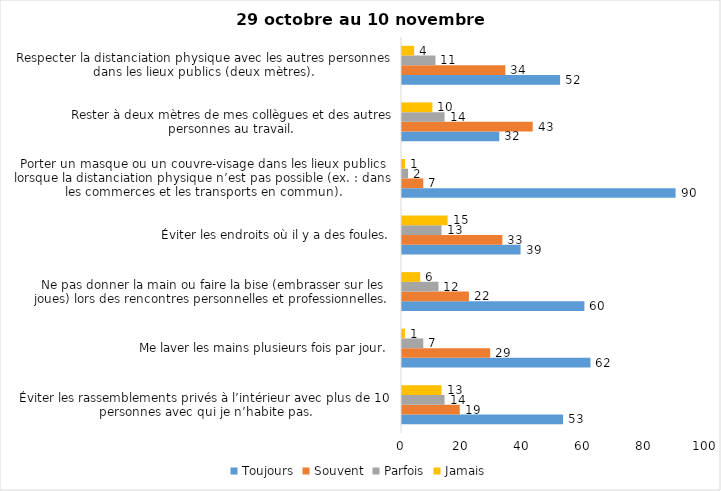
| Category | Toujours | Souvent | Parfois | Jamais |
|---|---|---|---|---|
| Éviter les rassemblements privés à l’intérieur avec plus de 10 personnes avec qui je n’habite pas. | 53 | 19 | 14 | 13 |
| Me laver les mains plusieurs fois par jour. | 62 | 29 | 7 | 1 |
| Ne pas donner la main ou faire la bise (embrasser sur les joues) lors des rencontres personnelles et professionnelles. | 60 | 22 | 12 | 6 |
| Éviter les endroits où il y a des foules. | 39 | 33 | 13 | 15 |
| Porter un masque ou un couvre-visage dans les lieux publics lorsque la distanciation physique n’est pas possible (ex. : dans les commerces et les transports en commun). | 90 | 7 | 2 | 1 |
| Rester à deux mètres de mes collègues et des autres personnes au travail. | 32 | 43 | 14 | 10 |
| Respecter la distanciation physique avec les autres personnes dans les lieux publics (deux mètres). | 52 | 34 | 11 | 4 |